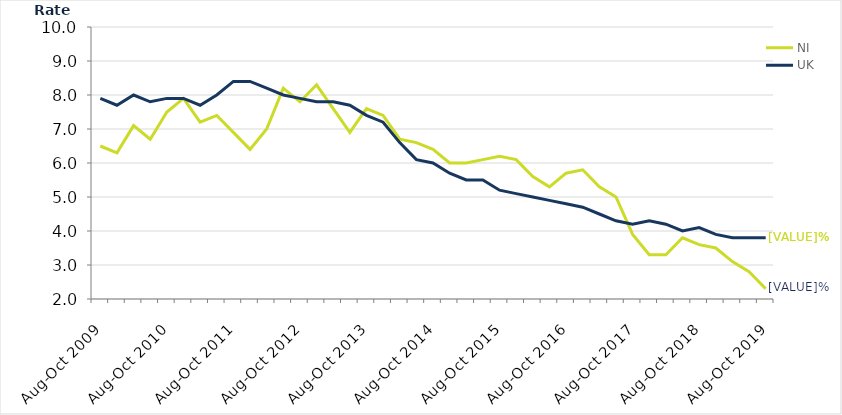
| Category | NI | UK |
|---|---|---|
| Aug-Oct 2009 | 6.5 | 7.9 |
| Nov-Jan 2010 | 6.3 | 7.7 |
| Feb-Apr 2010 | 7.1 | 8 |
| May-Jul 2010 | 6.7 | 7.8 |
| Aug-Oct 2010 | 7.5 | 7.9 |
| Nov-Jan 2011 | 7.9 | 7.9 |
| Feb-Apr 2011 | 7.2 | 7.7 |
| May-Jul 2011 | 7.4 | 8 |
| Aug-Oct 2011 | 6.9 | 8.4 |
| Nov-Jan 2012 | 6.4 | 8.4 |
| Feb-Apr 2012 | 7 | 8.2 |
| May-Jul 2012 | 8.2 | 8 |
| Aug-Oct 2012 | 7.8 | 7.9 |
| Nov-Jan 2013 | 8.3 | 7.8 |
| Feb-Apr 2013 | 7.6 | 7.8 |
| May-Jul 2013 | 6.9 | 7.7 |
| Aug-Oct 2013 | 7.6 | 7.4 |
| Nov-Jan 2014 | 7.4 | 7.2 |
| Feb-Apr 2014 | 6.7 | 6.6 |
| May-Jul 2014 | 6.6 | 6.1 |
| Aug-Oct 2014 | 6.4 | 6 |
| Nov-Jan 2015 | 6 | 5.7 |
| Feb-Apr 2015 | 6 | 5.5 |
| May-Jul 2015 | 6.1 | 5.5 |
| Aug-Oct 2015 | 6.2 | 5.2 |
| Nov-Jan 2016 | 6.1 | 5.1 |
| Feb-Apr 2016 | 5.6 | 5 |
| May-Jul 2016 | 5.3 | 4.9 |
| Aug-Oct 2016 | 5.7 | 4.8 |
| Nov-Jan 2017 | 5.8 | 4.7 |
| Feb-Apr 2017 | 5.3 | 4.5 |
| May-Jul 2017 | 5 | 4.3 |
| Aug-Oct 2017 | 3.9 | 4.2 |
| Nov-Jan 2018 | 3.3 | 4.3 |
| Feb-Apr 2018 | 3.3 | 4.2 |
| May-Jul 2018 | 3.8 | 4 |
| Aug-Oct 2018 | 3.6 | 4.1 |
| Nov-Jan 2019 | 3.5 | 3.9 |
| Feb-Apr 2019 | 3.1 | 3.8 |
| May-Jul 2019 | 2.8 | 3.8 |
| Aug-Oct 2019 | 2.3 | 3.8 |